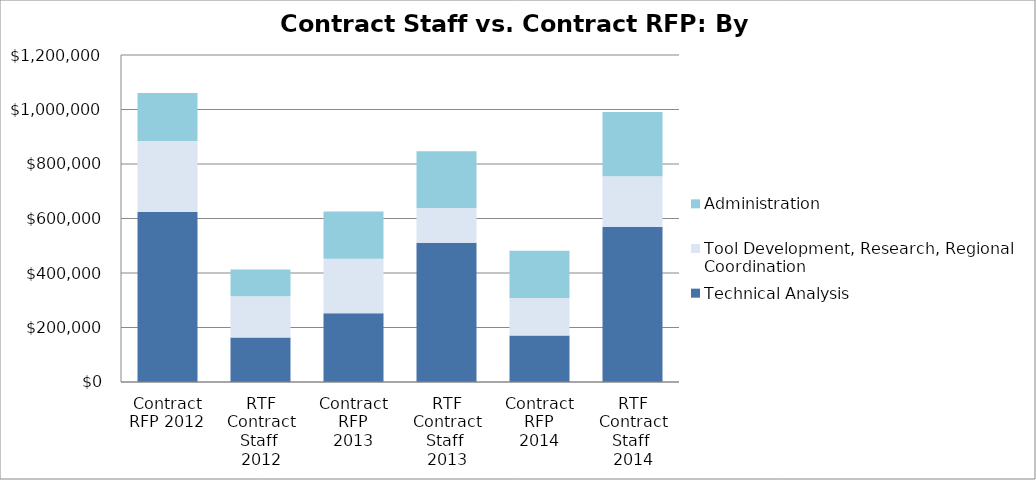
| Category | Technical Analysis | Tool Development, Research, Regional Coordination  | Administration |
|---|---|---|---|
| Contract RFP 2012 | 623570 | 261212 | 175778 |
| RTF Contract Staff 
2012 | 163012 | 151228 | 98200 |
| Contract RFP
2013 | 251883 | 200328 | 173814 |
| RTF Contract Staff 
2013 | 511229.2 | 127561.8 | 208184 |
| Contract RFP
2014 | 170500 | 137500 | 174000 |
| RTF Contract Staff 
2014 | 569000 | 186000 | 236000 |